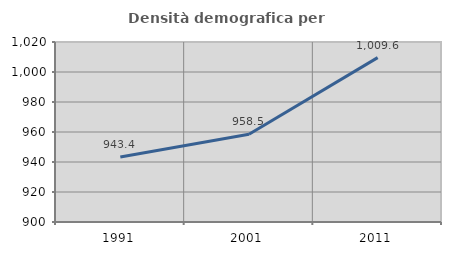
| Category | Densità demografica |
|---|---|
| 1991.0 | 943.35 |
| 2001.0 | 958.524 |
| 2011.0 | 1009.604 |